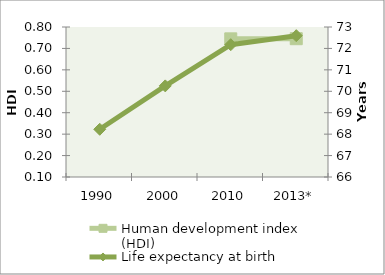
| Category | Human development index (HDI) |
|---|---|
| 1990 | 0 |
| 2000 | 0 |
| 2010 | 0.745 |
| 2013* | 0.745 |